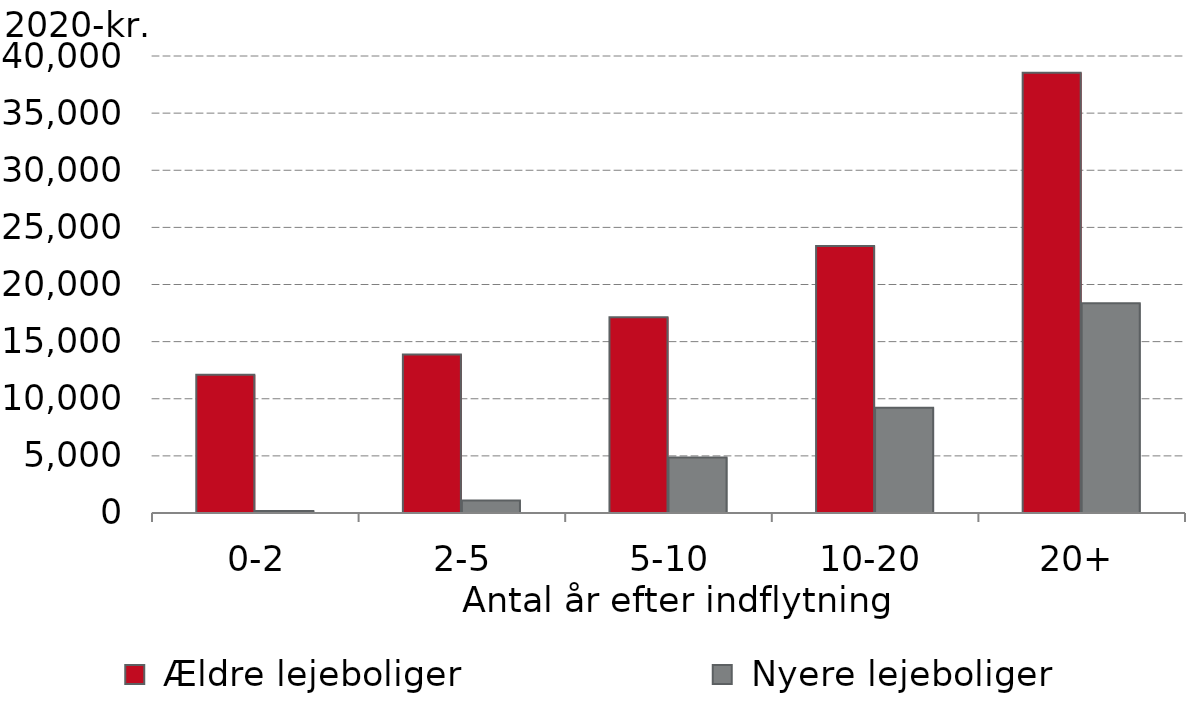
| Category |  Ældre lejeboliger |  Nyere lejeboliger |
|---|---|---|
|  0-2 | 12098.305 | 173.713 |
|  2-5 | 13879.214 | 1089.486 |
|  5-10 | 17126.326 | 4868.348 |
| 10-20 | 23360.553 | 9211.806 |
| 20+ | 38544.766 | 18355.832 |